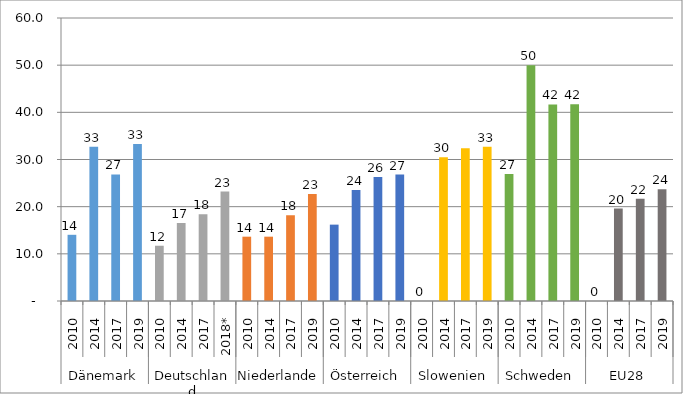
| Category | Frauenanteil in % |
|---|---|
| 0 | 14.035 |
| 1 | 32.727 |
| 2 | 26.829 |
| 3 | 33.3 |
| 4 | 11.717 |
| 5 | 16.537 |
| 6 | 18.394 |
| 7 | 23.2 |
| 8 | 13.636 |
| 9 | 13.636 |
| 10 | 18.182 |
| 11 | 22.7 |
| 12 | 16.19 |
| 13 | 23.529 |
| 14 | 26.316 |
| 15 | 26.8 |
| 16 | 0 |
| 17 | 30.476 |
| 18 | 32.407 |
| 19 | 32.7 |
| 20 | 26.923 |
| 21 | 50 |
| 22 | 41.667 |
| 23 | 41.7 |
| 24 | 0 |
| 25 | 19.605 |
| 26 | 21.693 |
| 27 | 23.7 |